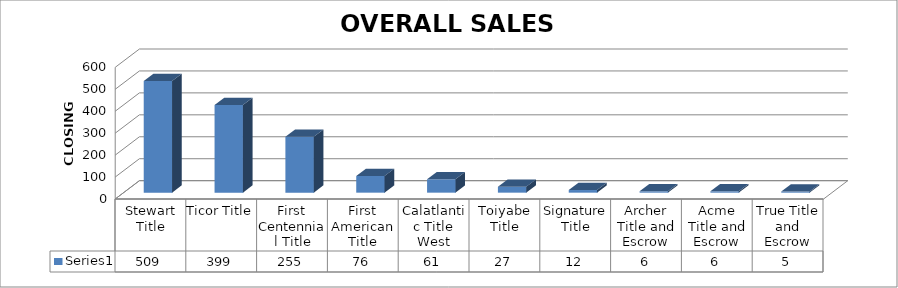
| Category | Series 0 |
|---|---|
| Stewart Title | 509 |
| Ticor Title | 399 |
| First Centennial Title | 255 |
| First American Title | 76 |
| Calatlantic Title West | 61 |
| Toiyabe Title | 27 |
| Signature Title | 12 |
| Archer Title and Escrow | 6 |
| Acme Title and Escrow | 6 |
| True Title and Escrow | 5 |